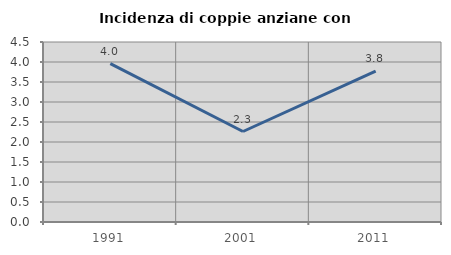
| Category | Incidenza di coppie anziane con figli |
|---|---|
| 1991.0 | 3.96 |
| 2001.0 | 2.262 |
| 2011.0 | 3.774 |